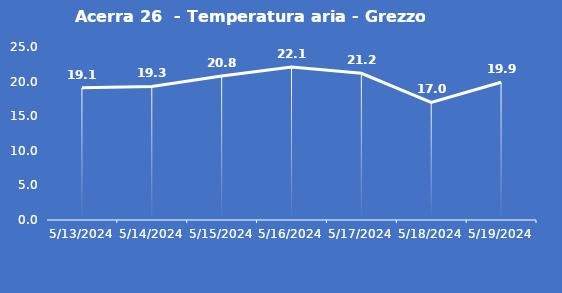
| Category | Acerra 26  - Temperatura aria - Grezzo (°C) |
|---|---|
| 5/13/24 | 19.1 |
| 5/14/24 | 19.3 |
| 5/15/24 | 20.8 |
| 5/16/24 | 22.1 |
| 5/17/24 | 21.2 |
| 5/18/24 | 17 |
| 5/19/24 | 19.9 |